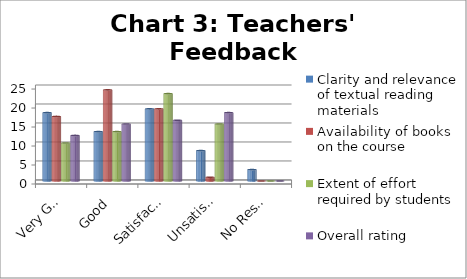
| Category | Clarity and relevance of textual reading materials | Availability of books on the course | Extent of effort required by students | Overall rating |
|---|---|---|---|---|
| Very Good | 18 | 17 | 10 | 12 |
| Good | 13 | 24 | 13 | 15 |
| Satisfactory | 19 | 19 | 23 | 16 |
| Unsatisfactory | 8 | 1 | 15 | 18 |
| No Response | 3 | 0 | 0 | 0 |